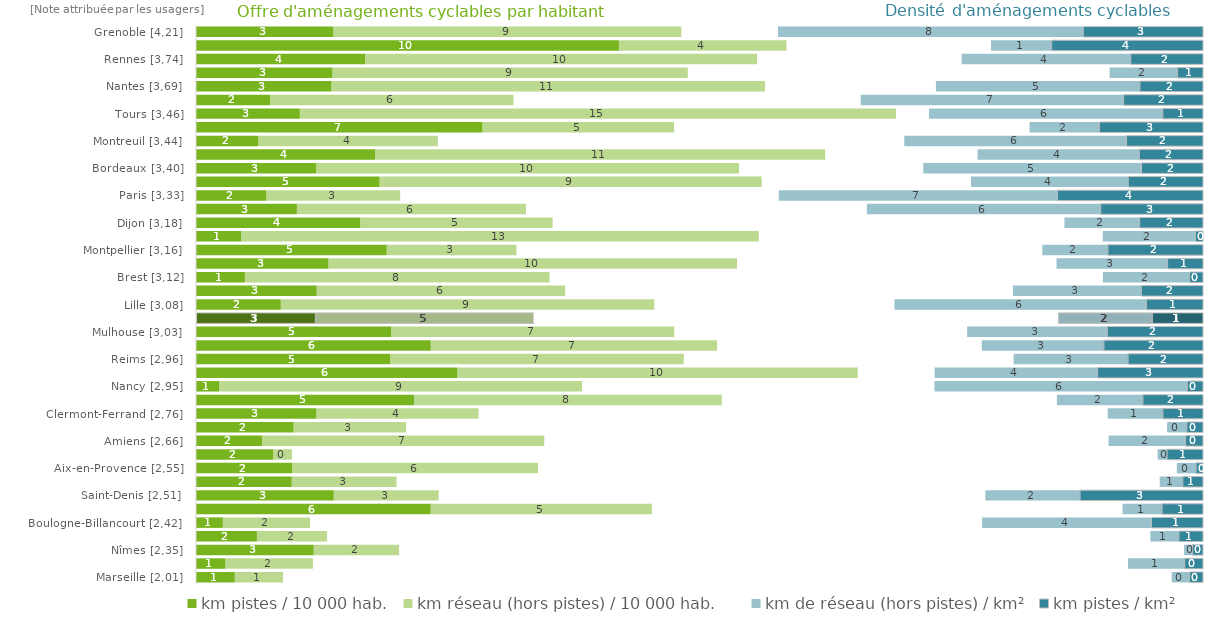
| Category | km pistes / 10 000 hab. | km réseau (hors pistes) / 10 000 hab. | Series 2 | km de réseau (hors pistes) / km² | km pistes / km² |
|---|---|---|---|---|---|
| Marseille [2,01] | 0.961 | 1.205 | 22.057 | 0.432 | 0.345 |
| Argenteuil [2,28] | 0.726 | 2.178 | 20.236 | 1.395 | 0.465 |
| Nîmes [2,35] | 2.921 | 2.125 | 19.484 | 0.198 | 0.272 |
| Toulon [2,36] | 1.512 | 1.745 | 20.435 | 0.701 | 0.607 |
| Boulogne-Billancourt [2,42] | 0.666 | 2.165 | 16.684 | 4.194 | 1.29 |
| Perpignan [2,49] | 5.826 | 5.493 | 11.685 | 0.969 | 1.028 |
| Saint-Denis [2,51] | 3.419 | 2.609 | 13.568 | 2.339 | 3.065 |
| Saint-Étienne [2,54] | 2.376 | 2.608 | 18.941 | 0.562 | 0.512 |
| Aix-en-Provence [2,55] | 2.386 | 6.106 | 15.858 | 0.467 | 0.183 |
| Nice [2,60] | 1.912 | 0.471 | 21.491 | 0.223 | 0.904 |
| Amiens [2,66] | 1.641 | 7.012 | 14.004 | 1.899 | 0.444 |
| Limoges [2,68] | 2.421 | 2.799 | 18.888 | 0.478 | 0.413 |
| Clermont-Ferrand [2,76] | 2.988 | 4.031 | 15.615 | 1.358 | 1.007 |
| Metz [2,89] | 5.411 | 7.644 | 8.317 | 2.124 | 1.504 |
| Nancy [2,95] | 0.575 | 9.014 | 8.744 | 6.267 | 0.4 |
| Toulouse [2,96] | 6.485 | 9.947 | 1.907 | 4.032 | 2.629 |
| Reims [2,96] | 4.823 | 7.289 | 8.186 | 2.83 | 1.872 |
| Orléans [2,98] | 5.828 | 7.113 | 6.568 | 3.018 | 2.473 |
| Mulhouse [3,03] | 4.843 | 7.036 | 7.266 | 3.468 | 2.387 |
| Moyenne [3,05] | 2.963 | 5.421 | 13.022 | 2.323 | 1.27 |
| Lille [3,08] | 2.105 | 9.279 | 5.957 | 6.243 | 1.416 |
| Rouen [3,11] | 2.996 | 6.174 | 11.111 | 3.178 | 1.542 |
| Brest [3,12] | 1.214 | 7.568 | 13.733 | 2.141 | 0.343 |
| Le Mans [3,14] | 3.288 | 10.144 | 7.932 | 2.746 | 0.89 |
| Montpellier [3,16] | 4.735 | 3.227 | 13.049 | 1.617 | 2.373 |
| Besançon [3,17] | 1.121 | 12.852 | 8.538 | 2.289 | 0.2 |
| Dijon [3,18] | 4.079 | 4.78 | 12.701 | 1.856 | 1.584 |
| Villeurbanne [3,31] | 2.505 | 5.687 | 8.464 | 5.793 | 2.552 |
| Paris [3,33] | 1.746 | 3.328 | 9.394 | 6.907 | 3.624 |
| Caen [3,38] | 4.556 | 9.492 | 5.193 | 3.891 | 1.868 |
| Bordeaux [3,40] | 2.987 | 10.494 | 4.576 | 5.405 | 1.538 |
| Angers [3,44] | 4.446 | 11.179 | 3.778 | 4.005 | 1.593 |
| Montreuil [3,44] | 1.547 | 4.459 | 11.579 | 5.506 | 1.91 |
| Le Havre [3,45] | 7.111 | 4.761 | 8.821 | 1.727 | 2.58 |
| Tours [3,46] | 2.578 | 14.803 | 0.819 | 5.793 | 1.009 |
| Lyon [3,51] | 1.841 | 6.045 | 8.617 | 6.514 | 1.983 |
| Nantes [3,69] | 3.362 | 10.765 | 4.242 | 5.053 | 1.578 |
| Annecy [3,69] | 3.388 | 8.824 | 10.471 | 1.674 | 0.643 |
| Rennes [3,74] | 4.197 | 9.732 | 5.079 | 4.187 | 1.806 |
| Strasbourg [4,18] | 10.499 | 4.164 | 5.074 | 1.494 | 3.768 |
| Grenoble [4,21] | 3.408 | 8.646 | 2.394 | 7.569 | 2.983 |